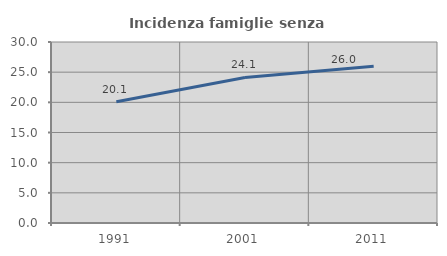
| Category | Incidenza famiglie senza nuclei |
|---|---|
| 1991.0 | 20.098 |
| 2001.0 | 24.12 |
| 2011.0 | 25.966 |